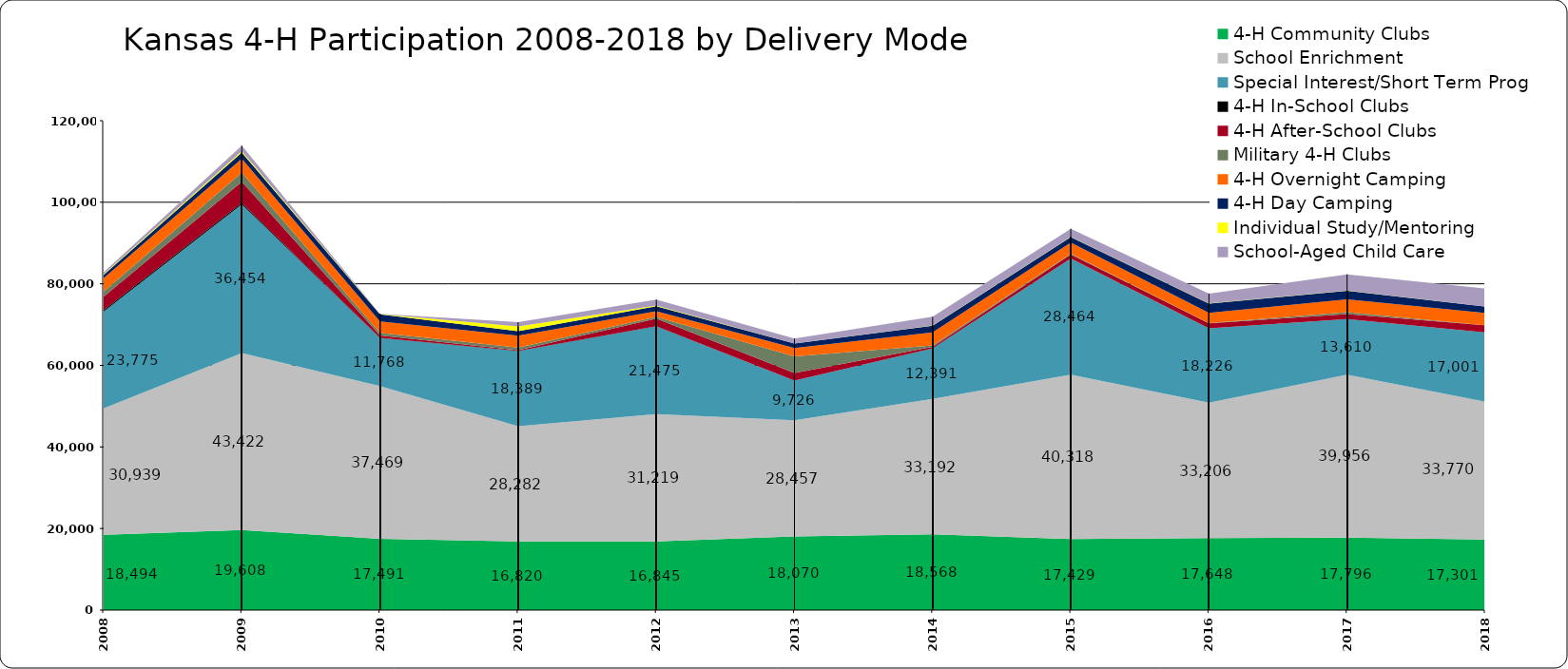
| Category | 4-H Community Clubs | School Enrichment | Special Interest/Short Term Prog | 4-H In-School Clubs | 4-H After-School Clubs | Military 4-H Clubs | 4-H Overnight Camping | 4-H Day Camping | Individual Study/Mentoring | School-Aged Child Care |
|---|---|---|---|---|---|---|---|---|---|---|
| 2008.0 | 18494 | 30939 | 23775 | 375 | 3272 | 1236 | 3293 | 801 | 190 | 486 |
| 2009.0 | 19608 | 43422 | 36454 | 371 | 5198 | 2232 | 3393 | 1491 | 349 | 1359 |
| 2010.0 | 17491 | 37469 | 11768 | 39 | 566 | 636 | 2789 | 1794 | 36 | 48 |
| 2011.0 | 16820 | 28282 | 18389 | 88 | 171 | 629 | 2921 | 1116 | 1118 | 1052 |
| 2012.0 | 16845 | 31219 | 21475 | 90 | 1824 | 413 | 1411 | 1210 | 171 | 1450 |
| 2013.0 | 18070 | 28457 | 9726 | 0 | 1870 | 4074 | 2030 | 1129 | 20 | 1188 |
| 2014.0 | 18568 | 33192 | 12391 | 66 | 329 | 366 | 3183 | 1612 | 69 | 2137 |
| 2015.0 | 17429 | 40318 | 28464 | 25 | 981 | 154 | 2738 | 1354 | 56 | 1982 |
| 2016.0 | 17648 | 33206 | 18226 | 0 | 1229 | 71 | 2502 | 2262 | 63 | 2410 |
| 2017.0 | 17796 | 39956 | 13610 | 0 | 1228 | 447 | 3148 | 2127 | 54 | 3968 |
| 2018.0 | 17301 | 33770 | 17001 | 0 | 1770 | 0 | 3027 | 1526 | 46 | 4381 |